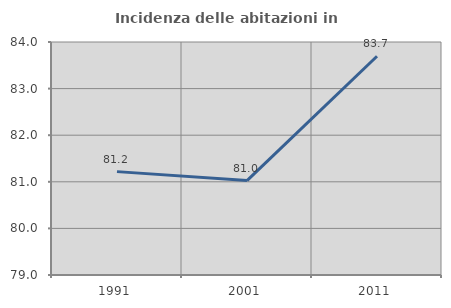
| Category | Incidenza delle abitazioni in proprietà  |
|---|---|
| 1991.0 | 81.218 |
| 2001.0 | 81.026 |
| 2011.0 | 83.695 |